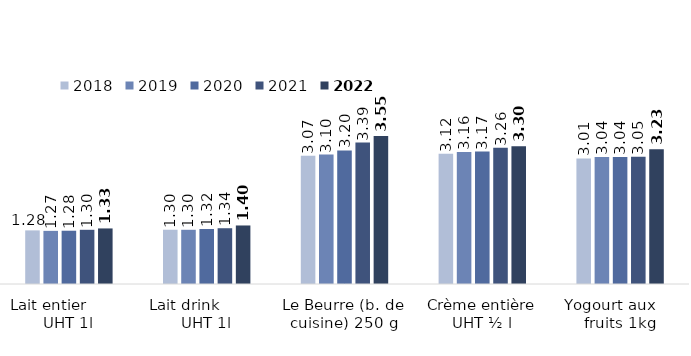
| Category | 2018 | 2019 | 2020 | 2021 | 2022 |
|---|---|---|---|---|---|
| Lait entier         UHT 1l | 1.284 | 1.273 | 1.276 | 1.298 | 1.331 |
| Lait drink          UHT 1l | 1.3 | 1.299 | 1.318 | 1.336 | 1.402 |
| Le Beurre (b. de cuisine) 250 g | 3.075 | 3.101 | 3.2 | 3.386 | 3.546 |
| Crème entière UHT ½ l | 3.121 | 3.163 | 3.173 | 3.262 | 3.297 |
| Yogourt aux     fruits 1kg | 3.008 | 3.042 | 3.041 | 3.046 | 3.229 |